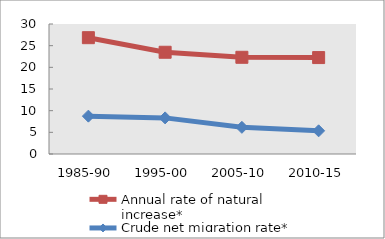
| Category | Annual rate of natural increase* | Crude net migration rate* |
|---|---|---|
| 1985-90 | 26.844 | 8.738 |
| 1995-00 | 23.479 | 8.333 |
| 2005-10 | 22.317 | 6.155 |
| 2010-15 | 22.254 | 5.349 |